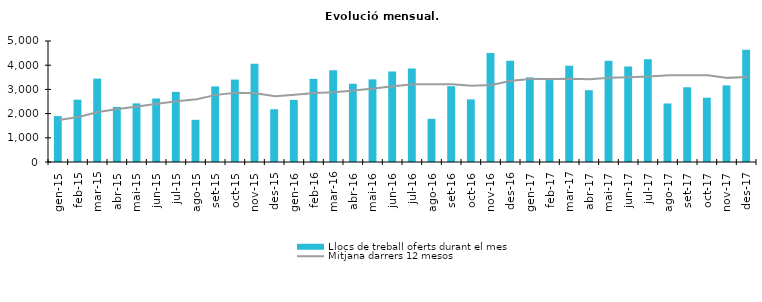
| Category | Llocs de treball oferts durant el mes |
|---|---|
| gen-15 | 1896 |
| feb-15 | 2576 |
| mar-15 | 3446 |
| abr-15 | 2276 |
| mai-15 | 2422 |
| jun-15 | 2624 |
| jul-15 | 2898 |
| ago-15 | 1743 |
| set-15 | 3123 |
| oct-15 | 3406 |
| nov-15 | 4062 |
| des-15 | 2180 |
| gen-16 | 2566 |
| feb-16 | 3437 |
| mar-16 | 3791 |
| abr-16 | 3234 |
| mai-16 | 3415 |
| jun-16 | 3737 |
| jul-16 | 3865 |
| ago-16 | 1784 |
| set-16 | 3131 |
| oct-16 | 2587 |
| nov-16 | 4508 |
| des-16 | 4182 |
| gen-17 | 3497 |
| feb-17 | 3386 |
| mar-17 | 3978 |
| abr-17 | 2968 |
| mai-17 | 4184 |
| jun-17 | 3947 |
| jul-17 | 4246 |
| ago-17 | 2418 |
| set-17 | 3087 |
| oct-17 | 2657 |
| nov-17 | 3166 |
| des-17 | 4634 |